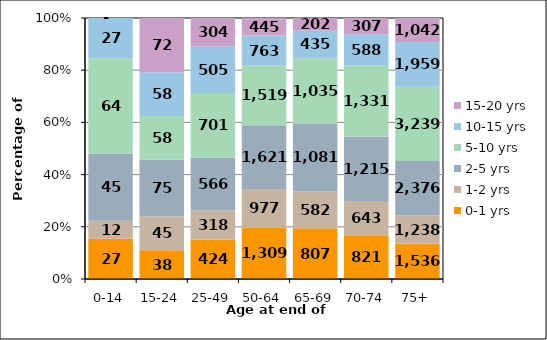
| Category | 0-1 yrs | 1-2 yrs | 2-5 yrs | 5-10 yrs | 10-15 yrs | 15-20 yrs |
|---|---|---|---|---|---|---|
| 0-14 | 27 | 12 | 45 | 64 | 27 | 0 |
| 15-24 | 38 | 45 | 75 | 58 | 58 | 72 |
| 25-49 | 424 | 318 | 566 | 701 | 505 | 304 |
| 50-64 | 1309 | 977 | 1621 | 1519 | 763 | 445 |
| 65-69 | 807 | 582 | 1081 | 1035 | 435 | 202 |
| 70-74 | 821 | 643 | 1215 | 1331 | 588 | 307 |
| 75+ | 1536 | 1238 | 2376 | 3239 | 1959 | 1042 |